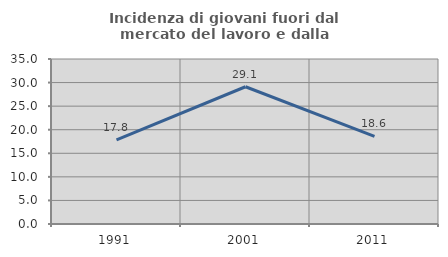
| Category | Incidenza di giovani fuori dal mercato del lavoro e dalla formazione  |
|---|---|
| 1991.0 | 17.83 |
| 2001.0 | 29.114 |
| 2011.0 | 18.584 |